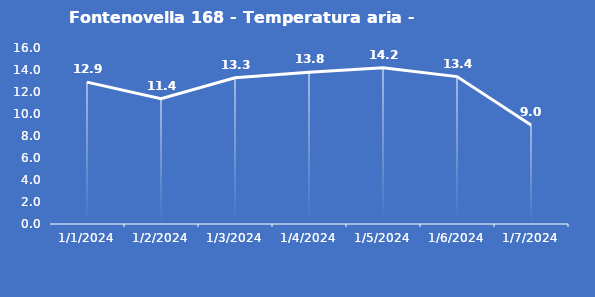
| Category | Fontenovella 168 - Temperatura aria - Grezzo (°C) |
|---|---|
| 1/1/24 | 12.9 |
| 1/2/24 | 11.4 |
| 1/3/24 | 13.3 |
| 1/4/24 | 13.8 |
| 1/5/24 | 14.2 |
| 1/6/24 | 13.4 |
| 1/7/24 | 9 |